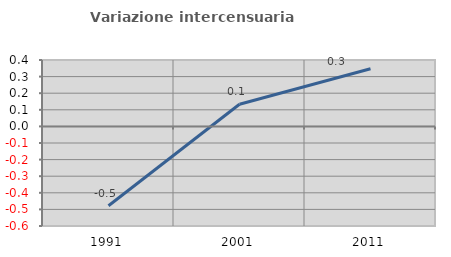
| Category | Variazione intercensuaria annua |
|---|---|
| 1991.0 | -0.478 |
| 2001.0 | 0.133 |
| 2011.0 | 0.347 |